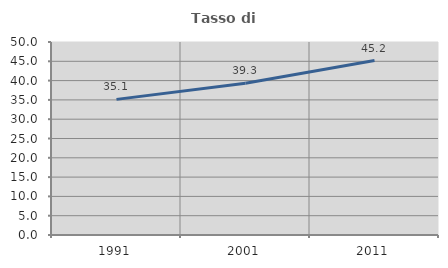
| Category | Tasso di occupazione   |
|---|---|
| 1991.0 | 35.135 |
| 2001.0 | 39.328 |
| 2011.0 | 45.183 |